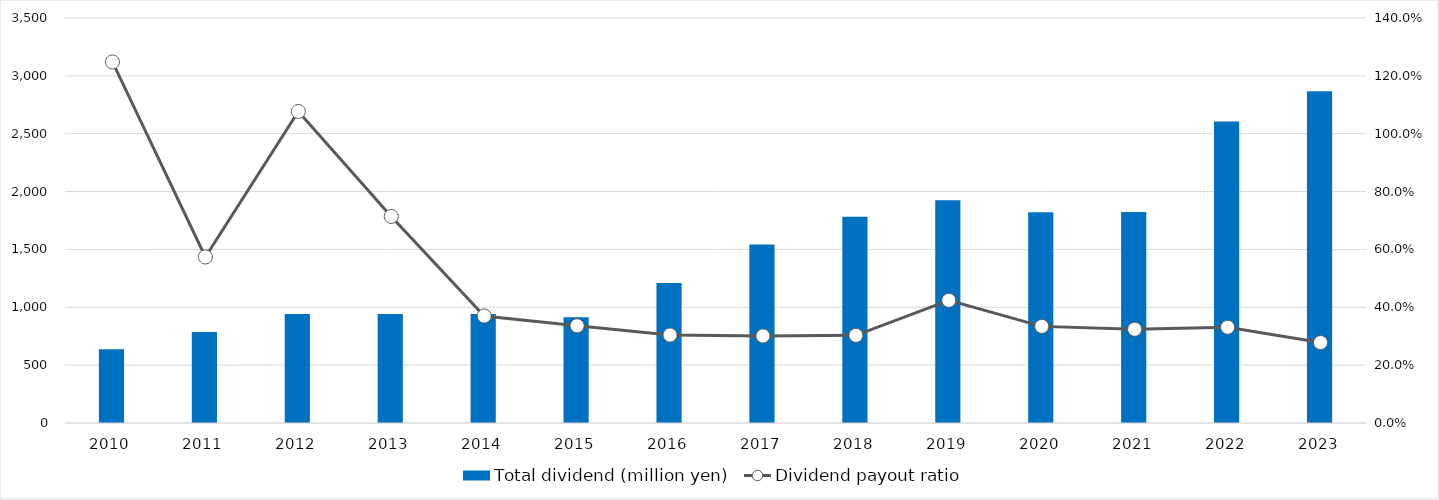
| Category | Total dividend (million yen) |
|---|---|
| 2010 | 638 |
| 2011 | 786 |
| 2012 | 941 |
| 2013 | 941 |
| 2014 | 941 |
| 2015 | 914 |
| 2016 | 1210 |
| 2017 | 1542 |
| 2018 | 1783 |
| 2019 | 1925 |
| 2020 | 1821 |
| 2021 | 1823 |
| 2022 | 2605 |
| 2023 | 2867 |